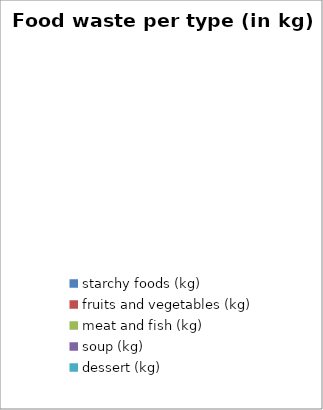
| Category | Series 0 |
|---|---|
| starchy foods (kg) | 0 |
| fruits and vegetables (kg) | 0 |
| meat and fish (kg) | 0 |
| soup (kg) | 0 |
| dessert (kg) | 0 |